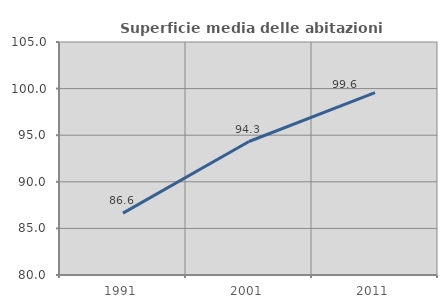
| Category | Superficie media delle abitazioni occupate |
|---|---|
| 1991.0 | 86.644 |
| 2001.0 | 94.322 |
| 2011.0 | 99.568 |